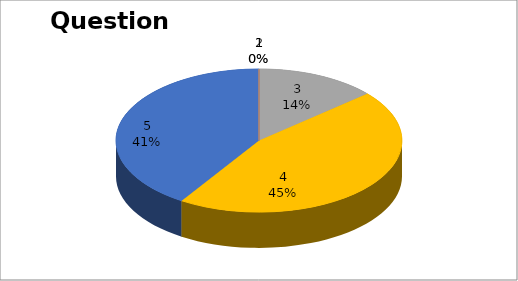
| Category | Series 0 |
|---|---|
| 0 | 0 |
| 1 | 0 |
| 2 | 3 |
| 3 | 10 |
| 4 | 9 |